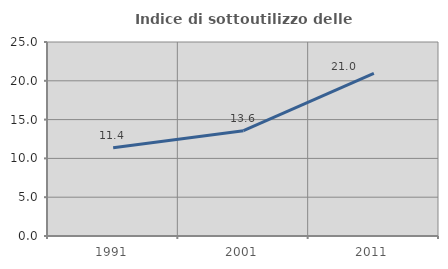
| Category | Indice di sottoutilizzo delle abitazioni  |
|---|---|
| 1991.0 | 11.373 |
| 2001.0 | 13.577 |
| 2011.0 | 20.962 |